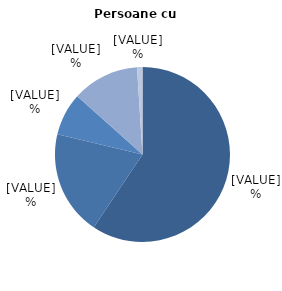
| Category | Persoane cu dizabilități |
|---|---|
| Salariat | 59.4 |
| Lucrător pe cont propriu în agricultură | 19.3 |
| Lucrător pe cont propriu în activități neagricole | 7.9 |
| Lucrător familial neremunerat | 12.4 |
| Patron | 1 |